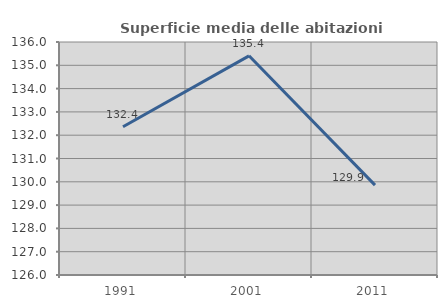
| Category | Superficie media delle abitazioni occupate |
|---|---|
| 1991.0 | 132.36 |
| 2001.0 | 135.407 |
| 2011.0 | 129.859 |